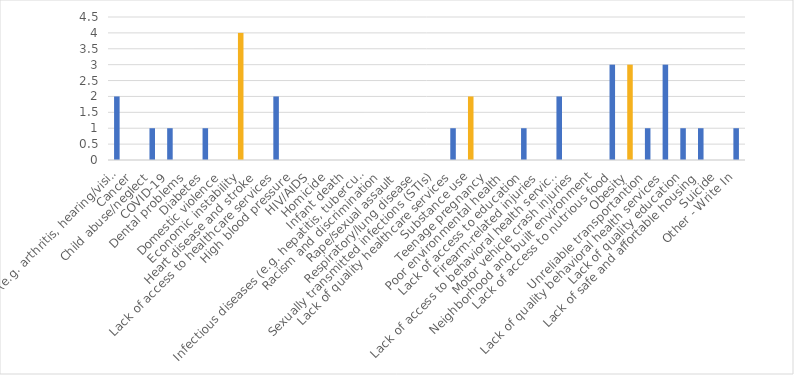
| Category | Number of Responses |
|---|---|
| Aging problems (e.g. arthritis, hearing/vision loss, etc.) | 2 |
| Cancer | 0 |
| Child abuse/neglect | 1 |
| COVID-19 | 1 |
| Dental problems | 0 |
| Diabetes | 1 |
| Domestic violence | 0 |
| Economic instability | 4 |
| Heart disease and stroke | 0 |
| Lack of access to healthcare services | 2 |
| High blood pressure | 0 |
| HIV/AIDS | 0 |
| Homicide | 0 |
| Infant death | 0 |
| Infectious diseases (e.g. hepatitis, tuberculosis, etc.) | 0 |
| Racism and discrimination | 0 |
| Rape/sexual assault | 0 |
| Respiratory/lung disease | 0 |
| Sexually transmitted infections (STIs) | 0 |
| Lack of quality healthcare services | 1 |
| Substance use | 2 |
| Teenage pregnancy | 0 |
| Poor environmental health | 0 |
| Lack of access to education | 1 |
| Firearm-related injuries | 0 |
| Lack of access to behavioral health services | 2 |
| Motor vehicle crash injuries | 0 |
| Neighborhood and built environment | 0 |
| Lack of access to nutrious food | 3 |
| Obesity | 3 |
| Unreliable transportantion | 1 |
| Lack of quality behavioral health services | 3 |
| Lack of quality education | 1 |
| Lack of safe and affortable housing | 1 |
| Suicide | 0 |
| Other - Write In | 1 |